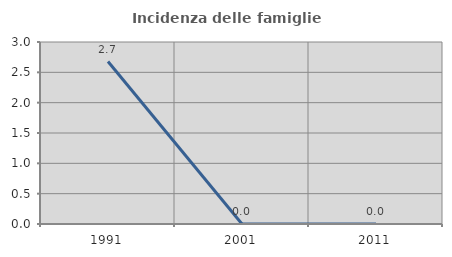
| Category | Incidenza delle famiglie numerose |
|---|---|
| 1991.0 | 2.679 |
| 2001.0 | 0 |
| 2011.0 | 0 |